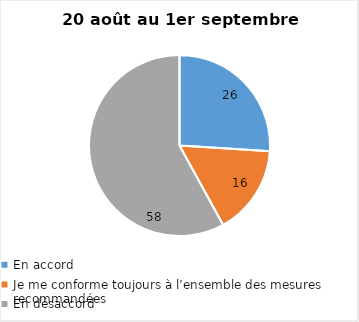
| Category | Series 0 |
|---|---|
| En accord | 26 |
| Je me conforme toujours à l’ensemble des mesures recommandées | 16 |
| En désaccord | 58 |